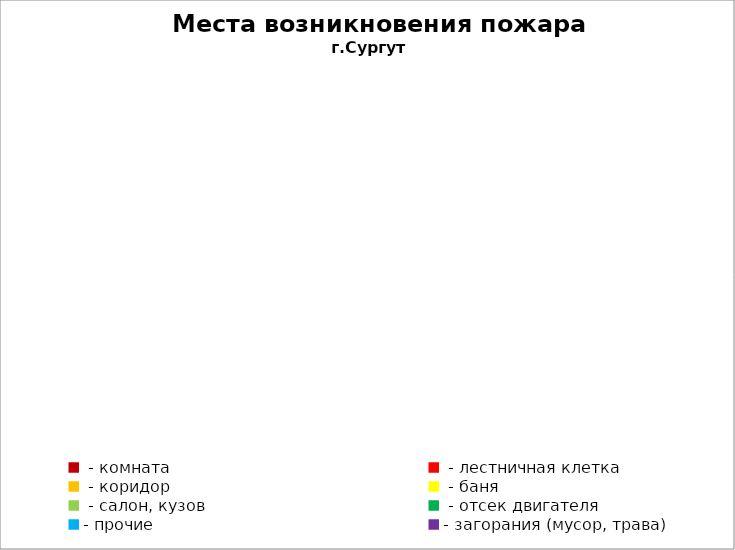
| Category | Места возникновения пожара |
|---|---|
|  - комната | 64 |
|  - лестничная клетка | 9 |
|  - коридор | 5 |
|  - баня | 30 |
|  - салон, кузов | 13 |
|  - отсек двигателя | 37 |
| - прочие | 105 |
| - загорания (мусор, трава)  | 40 |